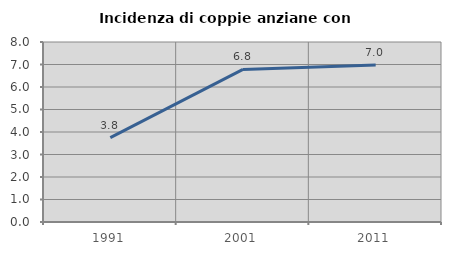
| Category | Incidenza di coppie anziane con figli |
|---|---|
| 1991.0 | 3.75 |
| 2001.0 | 6.78 |
| 2011.0 | 6.977 |